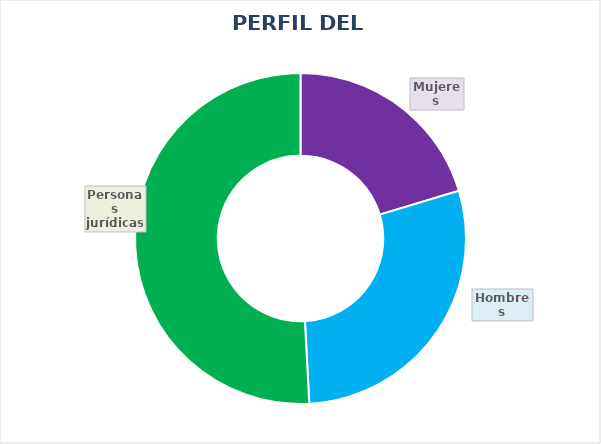
| Category | PORCENTAJE |
|---|---|
| Mujeres | 0.203 |
| Hombres | 0.288 |
| Personas jurídicas | 0.508 |